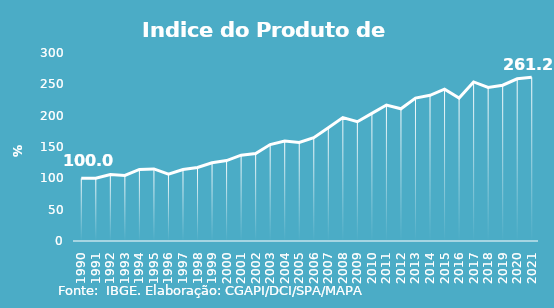
| Category | Indice de Prod. base 1990 |
|---|---|
| 1990.0 | 100 |
| 1991.0 | 100.275 |
| 1992.0 | 106.203 |
| 1993.0 | 104.57 |
| 1994.0 | 114.164 |
| 1995.0 | 115.024 |
| 1996.0 | 106.552 |
| 1997.0 | 114.037 |
| 1998.0 | 117.319 |
| 1999.0 | 124.734 |
| 2000.0 | 128.293 |
| 2001.0 | 136.975 |
| 2002.0 | 139.51 |
| 2003.0 | 153.868 |
| 2004.0 | 159.641 |
| 2005.0 | 157.136 |
| 2006.0 | 164.858 |
| 2007.0 | 180.781 |
| 2008.0 | 196.91 |
| 2009.0 | 190.309 |
| 2010.0 | 203.581 |
| 2011.0 | 217.041 |
| 2012.0 | 210.932 |
| 2013.0 | 228.009 |
| 2014.0 | 232.562 |
| 2015.0 | 242.318 |
| 2016.0 | 228.239 |
| 2017.0 | 253.826 |
| 2018.0 | 245.134 |
| 2019.0 | 248.619 |
| 2020.0 | 258.817 |
| 2021.0 | 261.188 |